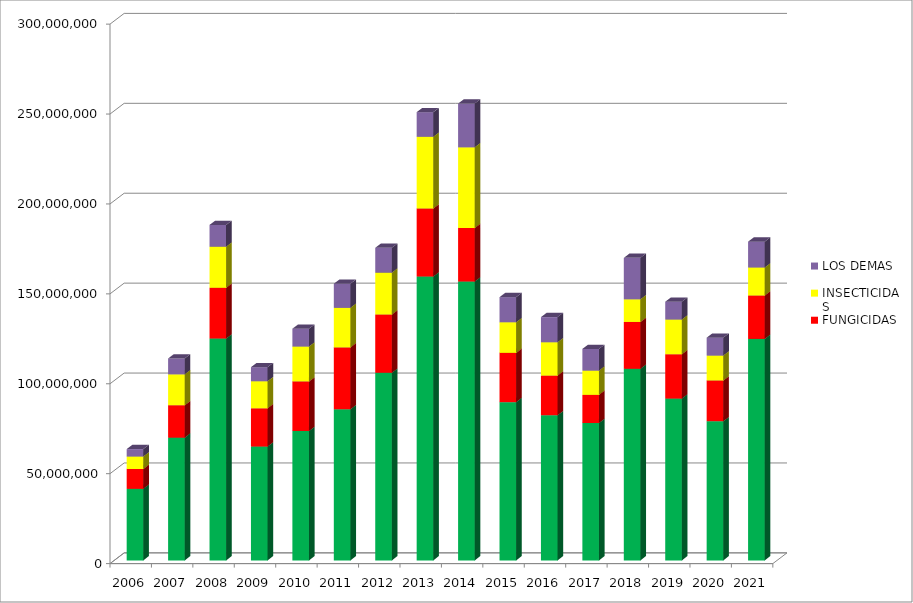
| Category | HERBICIDAS | FUNGICIDAS | INSECTICIDAS | LOS DEMAS |
|---|---|---|---|---|
| 2006.0 | 39789275.29 | 11027543.78 | 6966519 | 4105194.27 |
| 2007.0 | 68244942.6 | 18035666.03 | 17183947.01 | 8817391.97 |
| 2008.0 | 123395257.84 | 28183176.1 | 22884132.16 | 12072477.069 |
| 2009.0 | 63311261 | 21257452 | 15070408 | 7795374.32 |
| 2010.0 | 71968025 | 27553545 | 19419997 | 9878411 |
| 2011.0 | 84050675 | 34383815 | 22000866 | 13410371 |
| 2012.0 | 104331699 | 32393061 | 23290288 | 13820964 |
| 2013.0 | 157841597 | 37883820 | 39854625 | 13673348 |
| 2014.0 | 155038991.106 | 29743294.736 | 44929318.8 | 24319035.358 |
| 2015.0 | 87995662 | 27389627.905 | 17065149.89 | 13926954.38 |
| 2016.0 | 80732426 | 22017353 | 18576169 | 13961147 |
| 2017.0 | 76398756 | 15639470 | 13502931 | 12039076 |
| 2018.0 | 106544955 | 26033580 | 12613908 | 23050891 |
| 2019.0 | 89977059 | 24654239 | 19314431 | 9895950 |
| 2020.0 | 77412370 | 22638071 | 13850941 | 9941524 |
| 2021.0 | 123173543 | 24117349 | 15614295 | 14333635 |